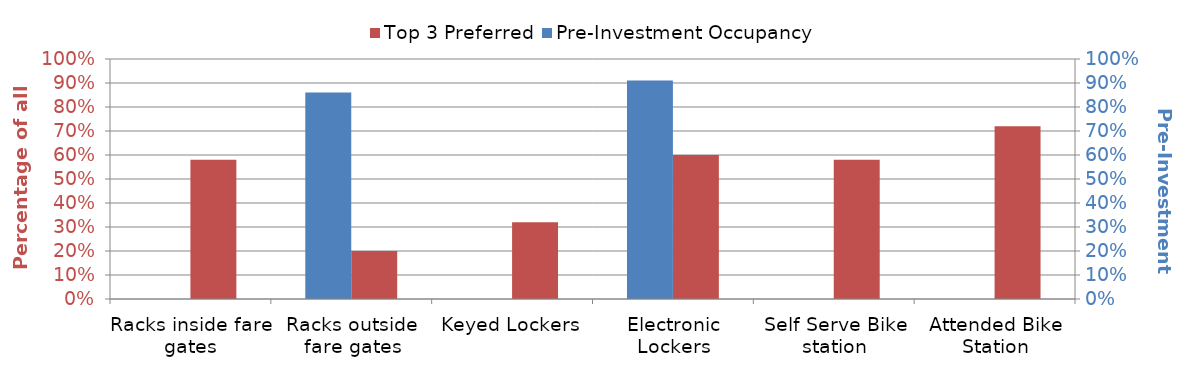
| Category | Series 3 | Top 3 Preferred |
|---|---|---|
| Racks inside fare gates | 0 | 0.58 |
| Racks outside fare gates | 0 | 0.2 |
| Keyed Lockers | 0 | 0.32 |
| Electronic Lockers | 0 | 0.6 |
| Self Serve Bike station | 0 | 0.58 |
| Attended Bike Station | 0 | 0.72 |